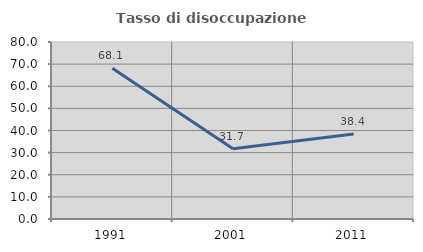
| Category | Tasso di disoccupazione giovanile  |
|---|---|
| 1991.0 | 68.148 |
| 2001.0 | 31.746 |
| 2011.0 | 38.372 |